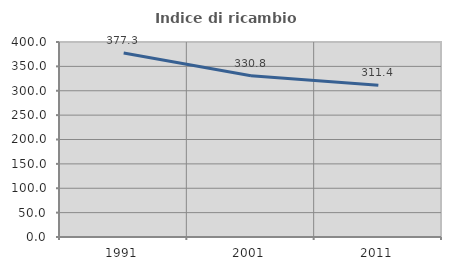
| Category | Indice di ricambio occupazionale  |
|---|---|
| 1991.0 | 377.273 |
| 2001.0 | 330.769 |
| 2011.0 | 311.429 |